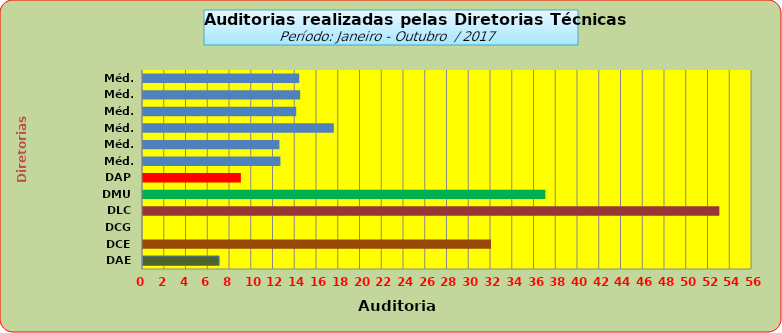
| Category | Series 0 |
|---|---|
| DAE | 7 |
| DCE | 32 |
| DCG | 0 |
| DLC | 53 |
| DMU | 37 |
| DAP | 9 |
| Méd. 2011 | 12.636 |
| Méd. 2012 | 12.545 |
| Méd. 2013 | 17.545 |
| Méd. 2014 | 14.091 |
| Méd. 2015 | 14.455 |
| Méd. 2016 | 14.364 |